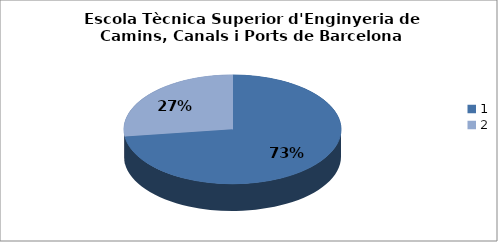
| Category | Escola Tècnica Superior d'Enginyeria de Camins, Canals i Ports de Barcelona (ETSECCPB) - Gènere |
|---|---|
| 0 | 0.729 |
| 1 | 0.271 |